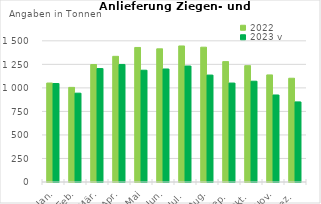
| Category | 2022 | 2023 v |
|---|---|---|
| 0 | 1051.511 | 1046.448 |
| 1 | 1005.378 | 943.911 |
| 2 | 1248.207 | 1205.32 |
| 3 | 1335.261 | 1249.007 |
| 4 | 1429.465 | 1187.736 |
| 5 | 1414.775 | 1200.847 |
| 6 | 1445.45 | 1232.488 |
| 7 | 1432.336 | 1136.129 |
| 8 | 1279.08 | 1051.239 |
| 9 | 1235.835 | 1070.827 |
| 10 | 1137.607 | 924.657 |
| 11 | 1102.351 | 850.93 |